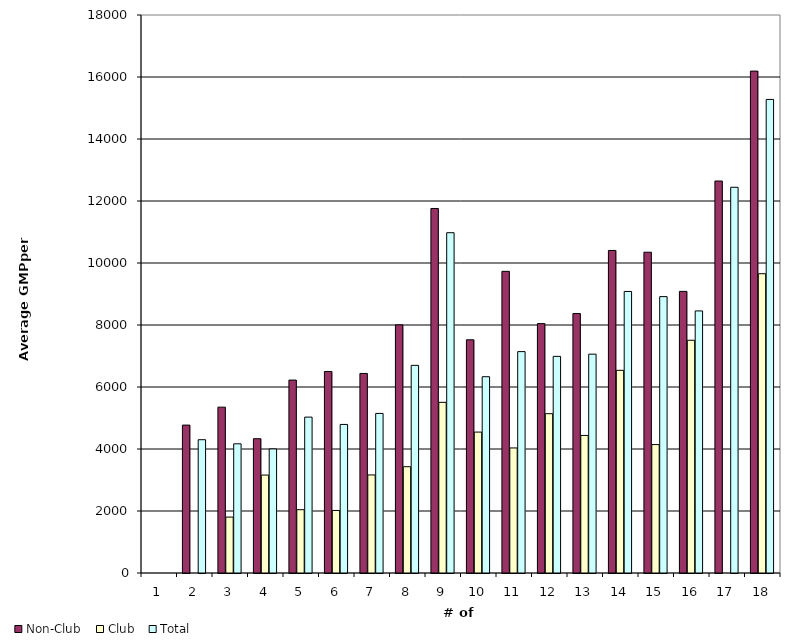
| Category | Non-Club | Club | Total |
|---|---|---|---|
| 1.0 | 0 | 0 | 0 |
| 2.0 | 4771.094 | 0 | 4299.757 |
| 3.0 | 5349.992 | 1803.489 | 4167.825 |
| 4.0 | 4332.365 | 3159.311 | 4002.444 |
| 5.0 | 6223.183 | 2041.882 | 5028.525 |
| 6.0 | 6500.17 | 2017.245 | 4792.389 |
| 7.0 | 6436.89 | 3163.179 | 5147.246 |
| 8.0 | 8005.45 | 3429.238 | 6697.961 |
| 9.0 | 11758.988 | 5505.442 | 10977.295 |
| 10.0 | 7522.313 | 4545.49 | 6331.584 |
| 11.0 | 9731.091 | 4034.2 | 7141.595 |
| 12.0 | 8044.486 | 5139.334 | 6988.067 |
| 13.0 | 8369.73 | 4437.712 | 7059.057 |
| 14.0 | 10404.817 | 6538.299 | 9082.061 |
| 15.0 | 10347.381 | 4142.594 | 8915.507 |
| 16.0 | 9084.383 | 7508.042 | 8453.847 |
| 17.0 | 12644.432 | 0 | 12442.551 |
| 18.0 | 16190.355 | 9654.312 | 15276.223 |